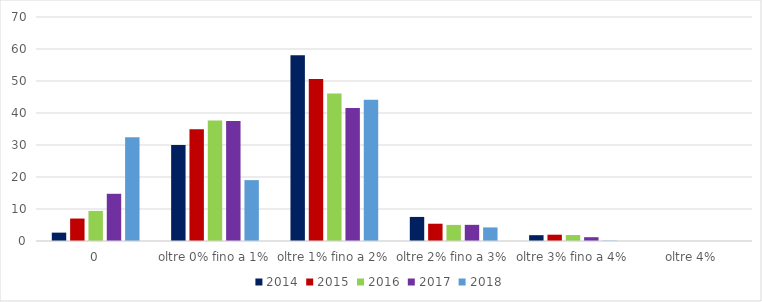
| Category | 2014 | 2015 | 2016 | 2017 | 2018 |
|---|---|---|---|---|---|
| 0 | 2.612 | 7.019 | 9.401 | 14.756 | 32.447 |
| oltre 0% fino a 1% | 29.995 | 34.955 | 37.636 | 37.481 | 19.021 |
| oltre 1% fino a 2% | 58.05 | 50.656 | 46.078 | 41.528 | 44.168 |
| oltre 2% fino a 3% | 7.523 | 5.4 | 5.025 | 5.049 | 4.246 |
| oltre 3% fino a 4% | 1.82 | 1.97 | 1.859 | 1.186 | 0.117 |
| oltre 4% | 0 | 0 | 0 | 0 | 0.001 |